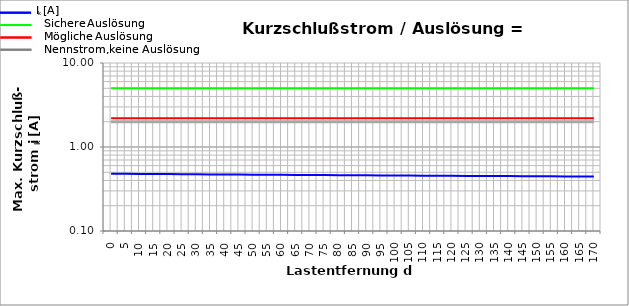
| Category | I [A] | mögliche Auslösung | sichere Auslösung | Nennstrom |
|---|---|---|---|---|
| 0.0 | 0.48 | 2.2 | 5 | 2 |
| 5.0 | 0.479 | 2.2 | 5 | 2 |
| 10.0 | 0.478 | 2.2 | 5 | 2 |
| 15.0 | 0.477 | 2.2 | 5 | 2 |
| 20.0 | 0.475 | 2.2 | 5 | 2 |
| 25.0 | 0.474 | 2.2 | 5 | 2 |
| 30.0 | 0.473 | 2.2 | 5 | 2 |
| 35.0 | 0.472 | 2.2 | 5 | 2 |
| 40.0 | 0.471 | 2.2 | 5 | 2 |
| 45.0 | 0.47 | 2.2 | 5 | 2 |
| 50.0 | 0.469 | 2.2 | 5 | 2 |
| 55.0 | 0.468 | 2.2 | 5 | 2 |
| 60.0 | 0.467 | 2.2 | 5 | 2 |
| 65.0 | 0.466 | 2.2 | 5 | 2 |
| 70.0 | 0.465 | 2.2 | 5 | 2 |
| 75.0 | 0.463 | 2.2 | 5 | 2 |
| 80.0 | 0.462 | 2.2 | 5 | 2 |
| 85.0 | 0.461 | 2.2 | 5 | 2 |
| 90.0 | 0.46 | 2.2 | 5 | 2 |
| 95.0 | 0.459 | 2.2 | 5 | 2 |
| 100.0 | 0.458 | 2.2 | 5 | 2 |
| 105.0 | 0.457 | 2.2 | 5 | 2 |
| 110.0 | 0.456 | 2.2 | 5 | 2 |
| 115.0 | 0.455 | 2.2 | 5 | 2 |
| 120.0 | 0.454 | 2.2 | 5 | 2 |
| 125.0 | 0.453 | 2.2 | 5 | 2 |
| 130.0 | 0.452 | 2.2 | 5 | 2 |
| 135.0 | 0.451 | 2.2 | 5 | 2 |
| 140.0 | 0.45 | 2.2 | 5 | 2 |
| 145.0 | 0.449 | 2.2 | 5 | 2 |
| 150.0 | 0.448 | 2.2 | 5 | 2 |
| 155.0 | 0.447 | 2.2 | 5 | 2 |
| 160.0 | 0.446 | 2.2 | 5 | 2 |
| 165.0 | 0.445 | 2.2 | 5 | 2 |
| 170.0 | 0.444 | 2.2 | 5 | 2 |